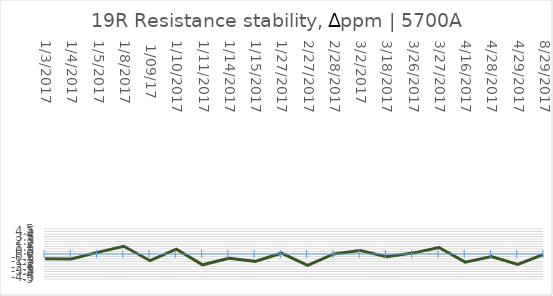
| Category | Series 0 |
|---|---|
| 1/3/2017 | -0.97 |
| 1/4/2017 | -0.99 |
| 1/5/2017 | 0.32 |
| 1/8/2017 | 1.55 |
|  1/09/17 | -1.34 |
| 1/10/2017 | 0.98 |
| 1/11/2017 | -2.16 |
| 1/14/2017 | -0.84 |
| 1/15/2017 | -1.47 |
| 1/27/2017 | 0.16 |
| 2/27/2017 | -2.28 |
| 2/28/2017 | 0.02 |
| 3/2/2017 | 0.69 |
| 3/18/2017 | -0.54 |
| 3/26/2017 | 0.18 |
| 3/27/2017 | 1.29 |
| 4/16/2017 | -1.62 |
| 4/28/2017 | -0.5 |
| 4/29/2017 | -2.09 |
| 8/29/2017 | -0.03 |